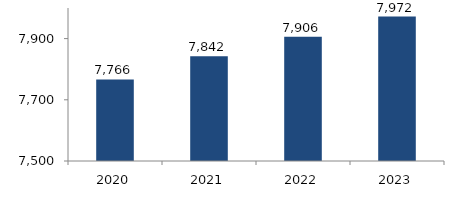
| Category | Bogotá |
|---|---|
| 2020.0 | 7766.47 |
| 2021.0 | 7842.472 |
| 2022.0 | 7906.431 |
| 2023.0 | 7972.284 |